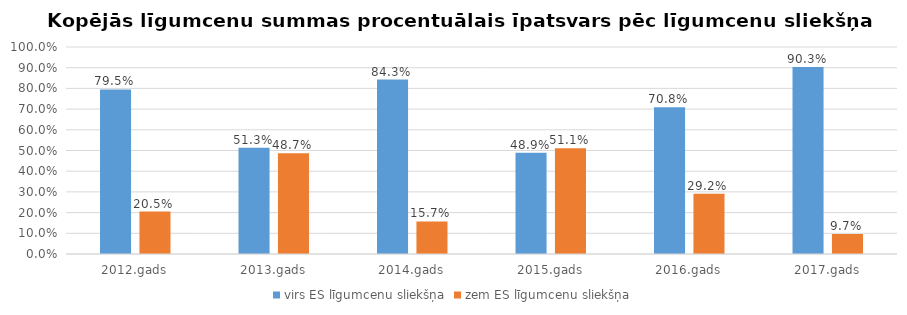
| Category | virs ES līgumcenu sliekšņa | zem ES līgumcenu sliekšņa |
|---|---|---|
| 2012.gads | 0.795 | 0.205 |
| 2013.gads | 0.513 | 0.487 |
| 2014.gads | 0.843 | 0.157 |
| 2015.gads | 0.489 | 0.511 |
| 2016.gads | 0.708 | 0.292 |
| 2017.gads | 0.903 | 0.097 |